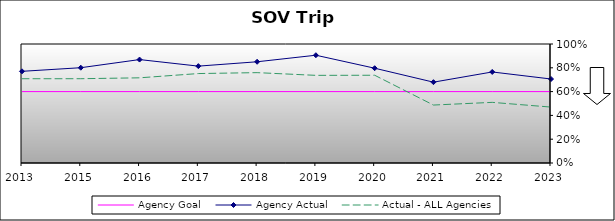
| Category | Agency Goal | Agency Actual | Actual - ALL Agencies |
|---|---|---|---|
| 2013.0 | 0.6 | 0.77 | 0.708 |
| 2015.0 | 0.6 | 0.801 | 0.708 |
| 2016.0 | 0.6 | 0.869 | 0.716 |
| 2017.0 | 0.6 | 0.814 | 0.752 |
| 2018.0 | 0.6 | 0.851 | 0.759 |
| 2019.0 | 0.6 | 0.906 | 0.736 |
| 2020.0 | 0.6 | 0.796 | 0.737 |
| 2021.0 | 0.6 | 0.679 | 0.487 |
| 2022.0 | 0.6 | 0.765 | 0.509 |
| 2023.0 | 0.6 | 0.706 | 0.47 |